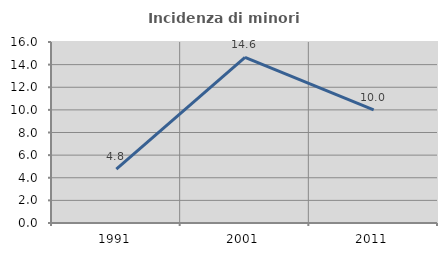
| Category | Incidenza di minori stranieri |
|---|---|
| 1991.0 | 4.762 |
| 2001.0 | 14.634 |
| 2011.0 | 10 |